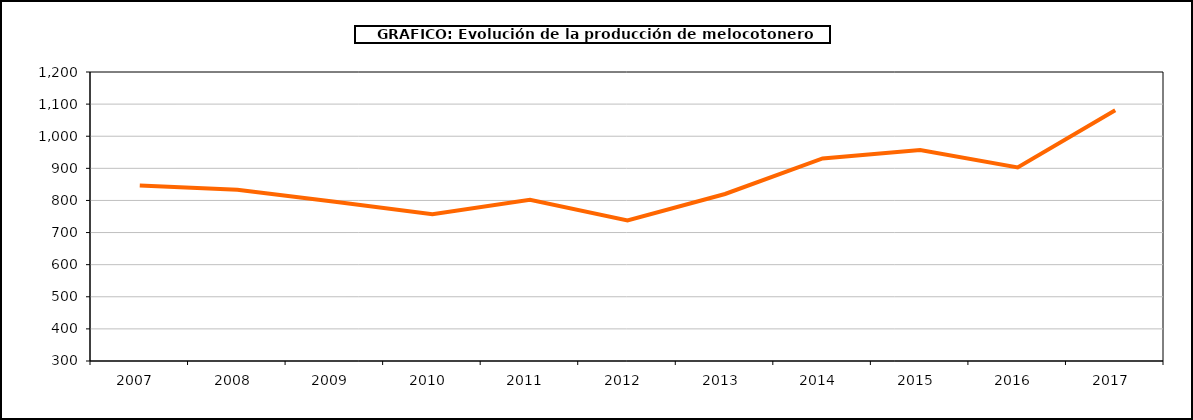
| Category | producción melocotonero |
|---|---|
| 2007.0 | 846.853 |
| 2008.0 | 833.409 |
| 2009.0 | 796.145 |
| 2010.0 | 757.34 |
| 2011.0 | 802.391 |
| 2012.0 | 737.531 |
| 2013.0 | 820.139 |
| 2014.0 | 930.862 |
| 2015.0 | 956.688 |
| 2016.0 | 902.884 |
| 2017.0 | 1081.157 |